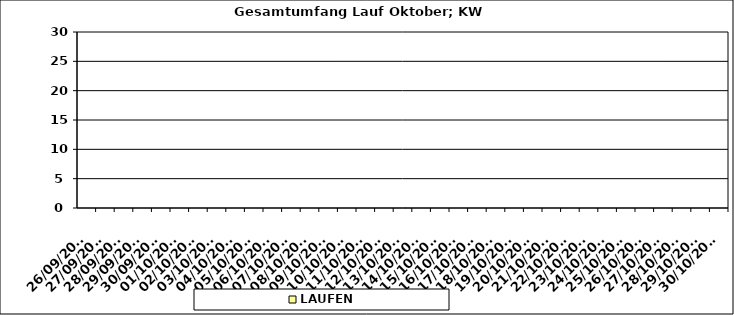
| Category | LAUFEN |
|---|---|
| 26/09/2022 | 0 |
| 27/09/2022 | 0 |
| 28/09/2022 | 0 |
| 29/09/2022 | 0 |
| 30/09/2022 | 0 |
| 01/10/2022 | 0 |
| 02/10/2022 | 0 |
| 03/10/2022 | 0 |
| 04/10/2022 | 0 |
| 05/10/2022 | 0 |
| 06/10/2022 | 0 |
| 07/10/2022 | 0 |
| 08/10/2022 | 0 |
| 09/10/2022 | 0 |
| 10/10/2022 | 0 |
| 11/10/2022 | 0 |
| 12/10/2022 | 0 |
| 13/10/2022 | 0 |
| 14/10/2022 | 0 |
| 15/10/2022 | 0 |
| 16/10/2022 | 0 |
| 17/10/2022 | 0 |
| 18/10/2022 | 0 |
| 19/10/2022 | 0 |
| 20/10/2022 | 0 |
| 21/10/2022 | 0 |
| 22/10/2022 | 0 |
| 23/10/2022 | 0 |
| 24/10/2022 | 0 |
| 25/10/2022 | 0 |
| 26/10/2022 | 0 |
| 27/10/2022 | 0 |
| 28/10/2022 | 0 |
| 29/10/2022 | 0 |
| 30/10/2022 | 0 |